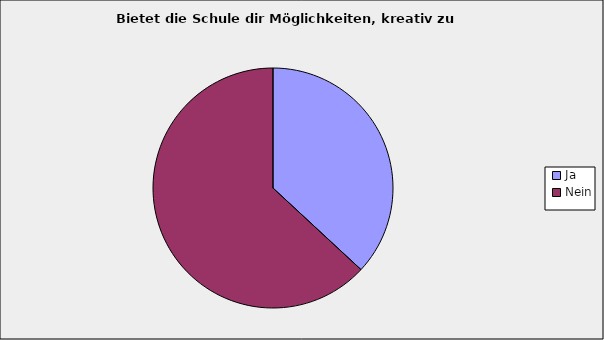
| Category | Series 0 |
|---|---|
| Ja | 0.369 |
| Nein | 0.631 |